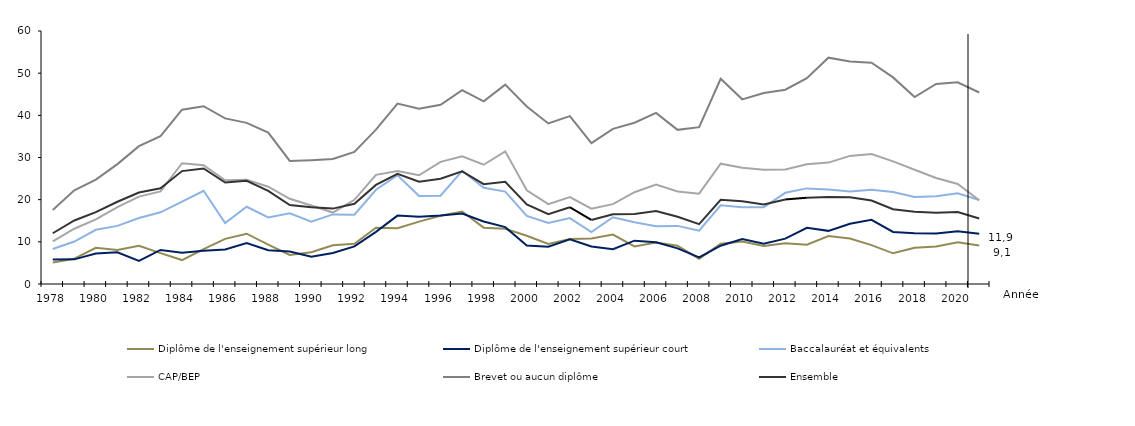
| Category | Diplôme de l'enseignement supérieur long | Diplôme de l'enseignement supérieur court | Baccalauréat et équivalents | CAP/BEP | Brevet ou aucun diplôme | Ensemble |
|---|---|---|---|---|---|---|
| 1978.0 | 5.08 | 5.79 | 8.29 | 10.11 | 17.57 | 12.035 |
| 1979.0 | 6 | 5.84 | 10.07 | 13.1 | 22.22 | 15.069 |
| 1980.0 | 8.59 | 7.23 | 12.86 | 15.33 | 24.77 | 17.037 |
| 1981.0 | 8.06 | 7.53 | 13.78 | 18.24 | 28.43 | 19.502 |
| 1982.0 | 9.04 | 5.47 | 15.64 | 20.73 | 32.68 | 21.694 |
| 1983.0 | 7.33 | 8.07 | 17.01 | 21.95 | 35.05 | 22.704 |
| 1984.0 | 5.68 | 7.4 | 19.52 | 28.65 | 41.33 | 26.777 |
| 1985.0 | 8.26 | 7.91 | 22.11 | 28.17 | 42.17 | 27.392 |
| 1986.0 | 10.71 | 8.18 | 14.46 | 24.58 | 39.28 | 24.061 |
| 1987.0 | 11.93 | 9.69 | 18.32 | 24.75 | 38.21 | 24.464 |
| 1988.0 | 9.36 | 7.99 | 15.8 | 23.08 | 35.89 | 22.09 |
| 1989.0 | 6.88 | 7.7 | 16.77 | 20.2 | 29.18 | 18.708 |
| 1990.0 | 7.53 | 6.46 | 14.8 | 18.62 | 29.37 | 18.203 |
| 1991.0 | 9.2 | 7.34 | 16.5 | 16.94 | 29.63 | 17.88 |
| 1992.0 | 9.56 | 8.91 | 16.44 | 19.96 | 31.33 | 19.028 |
| 1993.0 | 13.35 | 12.36 | 22.35 | 25.89 | 36.62 | 23.499 |
| 1994.0 | 13.25 | 16.22 | 25.78 | 26.8 | 42.8 | 26.125 |
| 1995.0 | 14.79 | 15.96 | 20.86 | 25.78 | 41.54 | 24.268 |
| 1996.0 | 16.19 | 16.27 | 20.93 | 28.96 | 42.51 | 24.968 |
| 1997.0 | 17.18 | 16.7 | 26.84 | 30.3 | 45.97 | 26.7 |
| 1998.0 | 13.36 | 14.81 | 22.81 | 28.28 | 43.31 | 23.667 |
| 1999.0 | 13.12 | 13.49 | 21.92 | 31.46 | 47.29 | 24.222 |
| 2000.0 | 11.45 | 9.15 | 16.14 | 22.24 | 42.09 | 18.881 |
| 2001.0 | 9.51 | 8.86 | 14.5 | 18.94 | 38.08 | 16.541 |
| 2002.0 | 10.7 | 10.6 | 15.62 | 20.6 | 39.83 | 18.201 |
| 2003.0 | 10.817 | 8.876 | 12.324 | 17.88 | 33.416 | 15.19 |
| 2004.0 | 11.731 | 8.259 | 15.839 | 18.931 | 36.803 | 16.54 |
| 2005.0 | 8.921 | 10.275 | 14.659 | 21.765 | 38.236 | 16.58 |
| 2006.0 | 9.812 | 9.904 | 13.696 | 23.572 | 40.588 | 17.32 |
| 2007.0 | 9.066 | 8.447 | 13.782 | 21.953 | 36.554 | 15.94 |
| 2008.0 | 5.955 | 6.293 | 12.659 | 21.432 | 37.19 | 14.2 |
| 2009.0 | 9.555 | 9.076 | 18.652 | 28.531 | 48.658 | 19.96 |
| 2010.0 | 10.084 | 10.642 | 18.218 | 27.589 | 43.792 | 19.61 |
| 2011.0 | 8.995 | 9.563 | 18.179 | 27.083 | 45.304 | 18.85 |
| 2012.0 | 9.679 | 10.767 | 21.628 | 27.161 | 46.082 | 20.05 |
| 2013.0 | 9.337 | 13.341 | 22.675 | 28.411 | 48.816 | 20.46 |
| 2014.0 | 11.376 | 12.603 | 22.405 | 28.794 | 53.674 | 20.61 |
| 2015.0 | 10.781 | 14.273 | 21.914 | 30.383 | 52.77 | 20.57 |
| 2016.0 | 9.219 | 15.231 | 22.336 | 30.824 | 52.467 | 19.8 |
| 2017.0 | 7.277 | 12.346 | 21.8 | 29.075 | 48.996 | 17.75 |
| 2018.0 | 8.611 | 12.052 | 20.629 | 27.099 | 44.341 | 17.12 |
| 2019.0 | 8.888 | 11.953 | 20.828 | 25.145 | 47.43 | 16.89 |
| 2020.0 | 9.915 | 12.51 | 21.507 | 23.728 | 47.819 | 17.09 |
| 2021.0 | 9.12 | 11.9 | 19.91 | 19.85 | 45.42 | 15.54 |